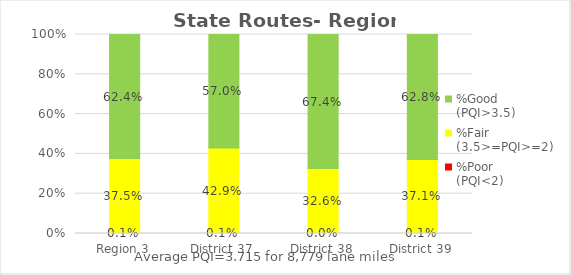
| Category | %Poor
(PQI<2) | %Fair
(3.5>=PQI>=2) | %Good
(PQI>3.5) |
|---|---|---|---|
| Region 3 | 0.001 | 0.375 | 0.624 |
| District 37 | 0.001 | 0.429 | 0.57 |
| District 38 | 0 | 0.326 | 0.674 |
| District 39 | 0.001 | 0.371 | 0.628 |